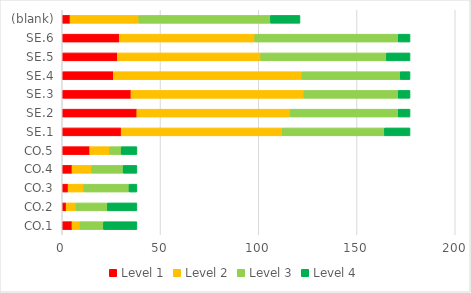
| Category | Level 1 | Level 2 | Level 3 | Level 4 |
|---|---|---|---|---|
| CO.1 | 5 | 4 | 12 | 17 |
| CO.2 | 2 | 5 | 16 | 15 |
| CO.3 | 3 | 8 | 23 | 4 |
| CO.4 | 5 | 10 | 16 | 7 |
| CO.5 | 14 | 10 | 6 | 8 |
| SE.1 | 30 | 82 | 52 | 13 |
| SE.2 | 38 | 78 | 55 | 6 |
| SE.3 | 35 | 88 | 48 | 6 |
| SE.4 | 26 | 96 | 50 | 5 |
| SE.5 | 28 | 73 | 64 | 12 |
| SE.6 | 29 | 69 | 73 | 6 |
| (blank) | 4 | 35 | 67 | 15 |